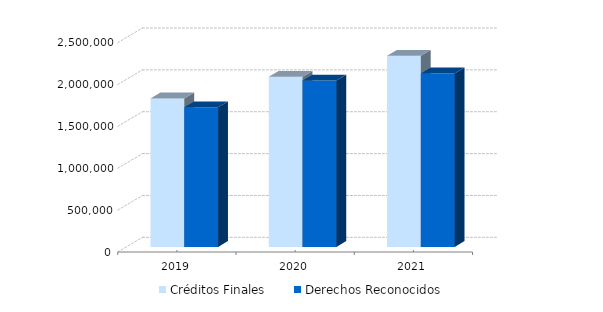
| Category | Créditos Finales | Derechos Reconocidos |
|---|---|---|
| 2019.0 | 1774024.81 | 1668299.76 |
| 2020.0 | 2032170.41 | 1986206.58 |
| 2021.0 | 2283189.71 | 2072033.26 |